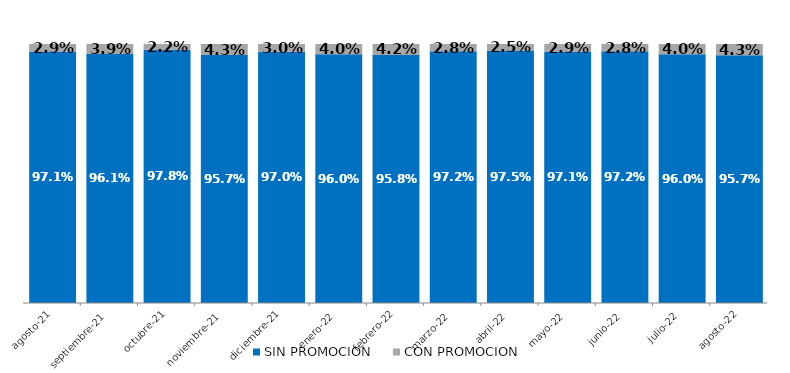
| Category | SIN PROMOCION   | CON PROMOCION   |
|---|---|---|
| 2021-08-01 | 0.971 | 0.029 |
| 2021-09-01 | 0.961 | 0.039 |
| 2021-10-01 | 0.978 | 0.022 |
| 2021-11-01 | 0.957 | 0.043 |
| 2021-12-01 | 0.97 | 0.03 |
| 2022-01-01 | 0.96 | 0.04 |
| 2022-02-01 | 0.958 | 0.042 |
| 2022-03-01 | 0.972 | 0.028 |
| 2022-04-01 | 0.975 | 0.025 |
| 2022-05-01 | 0.971 | 0.029 |
| 2022-06-01 | 0.972 | 0.028 |
| 2022-07-01 | 0.96 | 0.04 |
| 2022-08-01 | 0.957 | 0.043 |